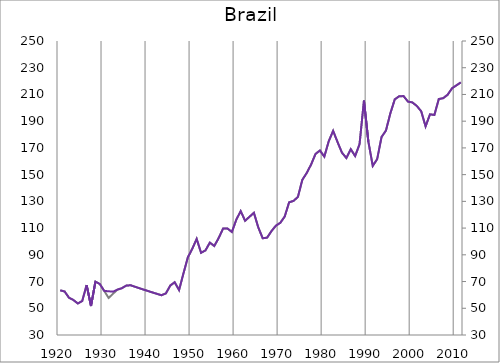
| Category | Bra17 |
|---|---|
| 1920.0 | 63.43 |
| 1921.0 | 62.552 |
| 1922.0 | 57.878 |
| 1923.0 | 56.183 |
| 1924.0 | 53.587 |
| 1925.0 | 55.421 |
| 1926.0 | 67.368 |
| 1927.0 | 51.706 |
| 1928.0 | 69.932 |
| 1929.0 | 68.148 |
| 1930.0 | 63.003 |
| 1931.0 | 57.712 |
| 1932.0 | 60.874 |
| 1933.0 | 63.957 |
| 1934.0 | 65.008 |
| 1935.0 | 66.976 |
| 1936.0 | 67.223 |
| 1937.0 | 66.103 |
| 1938.0 | 65.002 |
| 1939.0 | 63.919 |
| 1940.0 | 62.854 |
| 1941.0 | 61.807 |
| 1942.0 | 60.777 |
| 1943.0 | 59.765 |
| 1944.0 | 61.115 |
| 1945.0 | 66.973 |
| 1946.0 | 69.491 |
| 1947.0 | 63.627 |
| 1948.0 | 76.107 |
| 1949.0 | 88.148 |
| 1950.0 | 94.478 |
| 1951.0 | 101.897 |
| 1952.0 | 91.509 |
| 1953.0 | 93.321 |
| 1954.0 | 99.142 |
| 1955.0 | 96.605 |
| 1956.0 | 102.572 |
| 1957.0 | 109.609 |
| 1958.0 | 109.696 |
| 1959.0 | 107.093 |
| 1960.0 | 116.267 |
| 1961.0 | 122.721 |
| 1962.0 | 115.487 |
| 1963.0 | 118.46 |
| 1964.0 | 121.433 |
| 1965.0 | 110.47 |
| 1966.0 | 102.387 |
| 1967.0 | 102.851 |
| 1968.0 | 107.775 |
| 1969.0 | 111.822 |
| 1970.0 | 113.952 |
| 1971.0 | 118.638 |
| 1972.0 | 129.288 |
| 1973.0 | 130.353 |
| 1974.0 | 133.335 |
| 1975.0 | 146.114 |
| 1976.0 | 151.226 |
| 1977.0 | 157.616 |
| 1978.0 | 165.497 |
| 1979.0 | 168.053 |
| 1980.0 | 163.468 |
| 1981.0 | 175.02 |
| 1982.0 | 182.739 |
| 1983.0 | 174.383 |
| 1984.0 | 166.442 |
| 1985.0 | 162.458 |
| 1986.0 | 169.056 |
| 1987.0 | 163.917 |
| 1988.0 | 172.8 |
| 1989.0 | 205.39 |
| 1990.0 | 174.761 |
| 1991.0 | 156.547 |
| 1992.0 | 161.61 |
| 1993.0 | 178.146 |
| 1994.0 | 183.042 |
| 1995.0 | 195.896 |
| 1996.0 | 206.314 |
| 1997.0 | 208.68 |
| 1998.0 | 208.768 |
| 1999.0 | 204.649 |
| 2000.0 | 204.034 |
| 2001.0 | 201.4 |
| 2002.0 | 197.462 |
| 2003.0 | 186.105 |
| 2004.0 | 195.119 |
| 2005.0 | 194.67 |
| 2006.0 | 206.562 |
| 2007.0 | 207.233 |
| 2008.0 | 209.723 |
| 2009.0 | 214.585 |
| 2010.0 | 216.796 |
| 2011.0 | 219.03 |